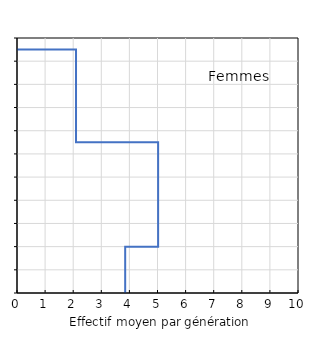
| Category | Femmes |
|---|---|
| 3.85 | 0 |
| 3.85 | 20 |
| 5.022222222222222 | 20 |
| 5.022222222222222 | 65 |
| 2.1 | 65 |
| 2.1 | 105 |
| 0.0 | 105 |